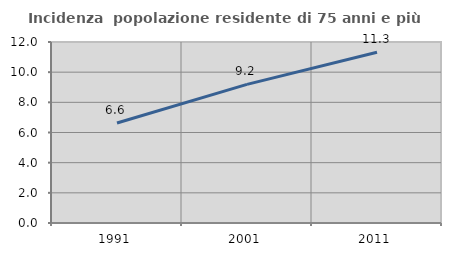
| Category | Incidenza  popolazione residente di 75 anni e più |
|---|---|
| 1991.0 | 6.631 |
| 2001.0 | 9.19 |
| 2011.0 | 11.321 |